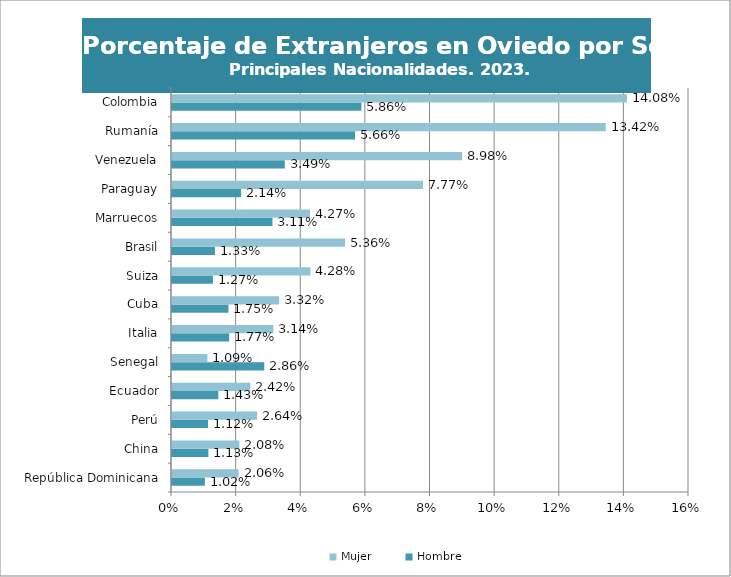
| Category | Hombre | Mujer |
|---|---|---|
| República Dominicana | 0.01 | 0.021 |
| China | 0.011 | 0.021 |
| Perú | 0.011 | 0.026 |
| Ecuador | 0.014 | 0.024 |
| Senegal | 0.029 | 0.011 |
| Italia | 0.018 | 0.031 |
| Cuba | 0.017 | 0.033 |
| Suiza | 0.013 | 0.043 |
| Brasil | 0.013 | 0.054 |
| Marruecos | 0.031 | 0.043 |
| Paraguay | 0.021 | 0.078 |
| Venezuela | 0.035 | 0.09 |
| Rumanía | 0.057 | 0.134 |
| Colombia | 0.059 | 0.141 |